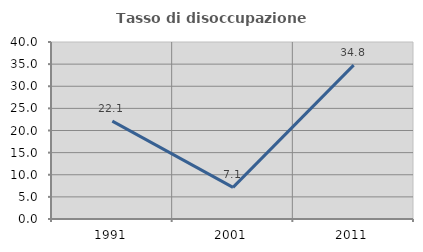
| Category | Tasso di disoccupazione giovanile  |
|---|---|
| 1991.0 | 22.124 |
| 2001.0 | 7.143 |
| 2011.0 | 34.783 |